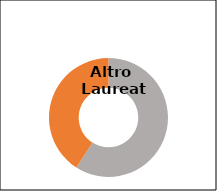
| Category | Series 1 |
|---|---|
| Donne  | 0.591 |
| Uomini  | 0.409 |